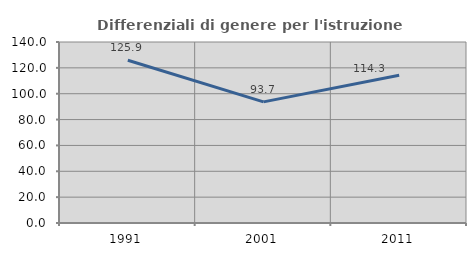
| Category | Differenziali di genere per l'istruzione superiore |
|---|---|
| 1991.0 | 125.86 |
| 2001.0 | 93.696 |
| 2011.0 | 114.342 |